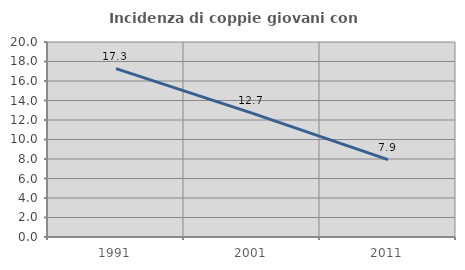
| Category | Incidenza di coppie giovani con figli |
|---|---|
| 1991.0 | 17.272 |
| 2001.0 | 12.707 |
| 2011.0 | 7.937 |